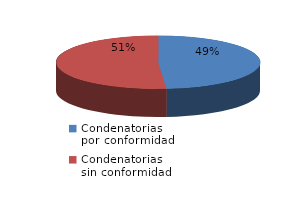
| Category | Series 0 |
|---|---|
| 0 | 92 |
| 1 | 97 |